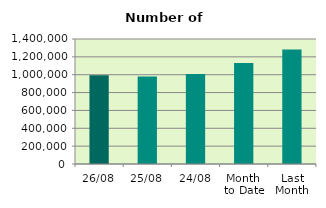
| Category | Series 0 |
|---|---|
| 26/08 | 994346 |
| 25/08 | 980742 |
| 24/08 | 1008872 |
| Month 
to Date | 1130739.474 |
| Last
Month | 1281605.545 |